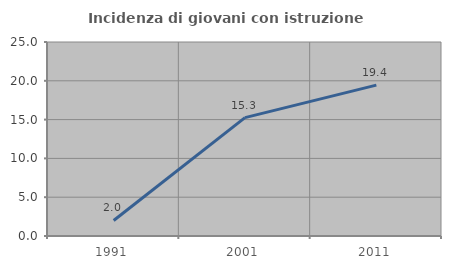
| Category | Incidenza di giovani con istruzione universitaria |
|---|---|
| 1991.0 | 2 |
| 2001.0 | 15.254 |
| 2011.0 | 19.444 |